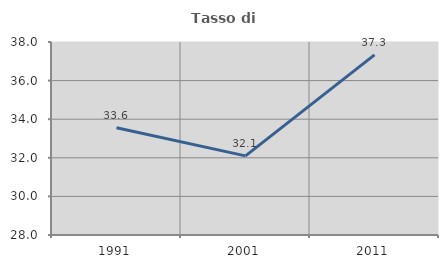
| Category | Tasso di occupazione   |
|---|---|
| 1991.0 | 33.556 |
| 2001.0 | 32.1 |
| 2011.0 | 37.333 |